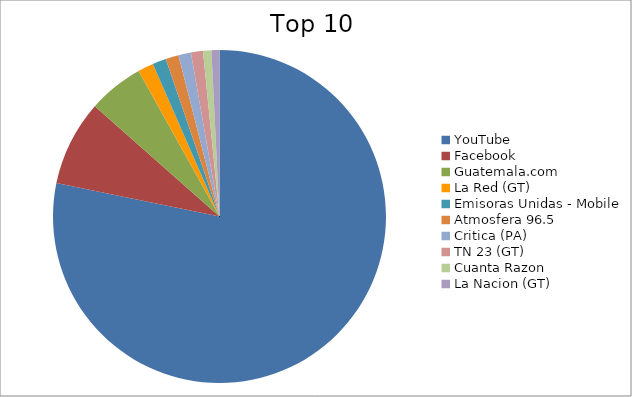
| Category | Series 0 |
|---|---|
| YouTube | 65.68 |
| Facebook | 6.98 |
| Guatemala.com | 4.53 |
| La Red (GT) | 1.28 |
| Emisoras Unidas - Mobile | 1.11 |
| Atmosfera 96.5 | 1.06 |
| Critica (PA) | 1.02 |
| TN 23 (GT) | 0.98 |
| Cuanta Razon | 0.68 |
| La Nacion (GT) | 0.65 |